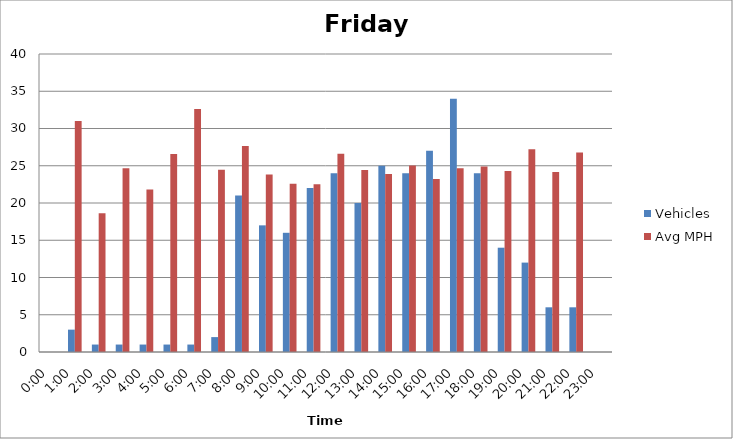
| Category | Vehicles | Avg MPH |
|---|---|---|
| 0:00 | 0 | 0 |
| 1:00 | 3 | 31 |
| 2:00 | 1 | 18.61 |
| 3:00 | 1 | 24.68 |
| 4:00 | 1 | 21.81 |
| 5:00 | 1 | 26.58 |
| 6:00 | 1 | 32.61 |
| 7:00 | 2 | 24.45 |
| 8:00 | 21 | 27.66 |
| 9:00 | 17 | 23.82 |
| 10:00 | 16 | 22.57 |
| 11:00 | 22 | 22.52 |
| 12:00 | 24 | 26.6 |
| 13:00 | 20 | 24.42 |
| 14:00 | 25 | 23.89 |
| 15:00 | 24 | 25.03 |
| 16:00 | 27 | 23.21 |
| 17:00 | 34 | 24.65 |
| 18:00 | 24 | 24.91 |
| 19:00 | 14 | 24.28 |
| 20:00 | 12 | 27.21 |
| 21:00 | 6 | 24.17 |
| 22:00 | 6 | 26.79 |
| 23:00 | 0 | 0 |